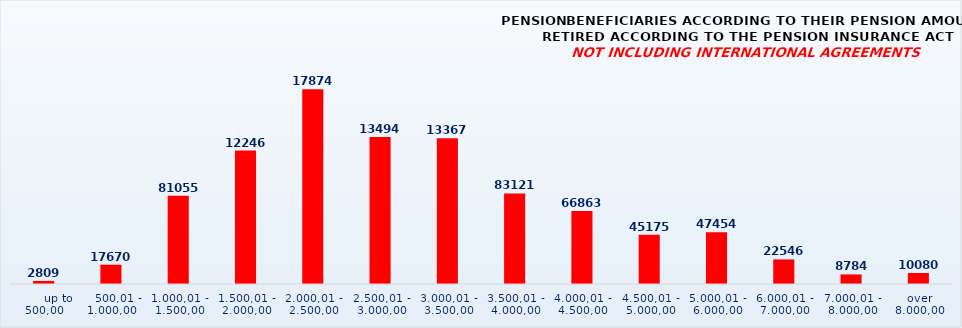
| Category | PENSION BENEFICIARIES ACCORDING TO TYPES AND AMOUNTS OF PENSION, RETIRED ACCORDING TO THE PENSION INSURANCE ACT
NOT INCLUDING INTERNATIONAL AGREEMENTS |
|---|---|
|       up to 500,00 | 2809 |
|    500,01 - 1.000,00 | 17670 |
| 1.000,01 - 1.500,00 | 81055 |
| 1.500,01 - 2.000,00 | 122462 |
| 2.000,01 - 2.500,00 | 178745 |
| 2.500,01 - 3.000,00 | 134949 |
| 3.000,01 - 3.500,00 | 133678 |
| 3.500,01 - 4.000,00 | 83121 |
| 4.000,01 - 4.500,00 | 66863 |
| 4.500,01 - 5.000,00 | 45175 |
| 5.000,01 - 6.000,00 | 47454 |
| 6.000,01 - 7.000,00 | 22546 |
| 7.000,01 - 8.000,00 | 8784 |
|  over  8.000,00 | 10080 |